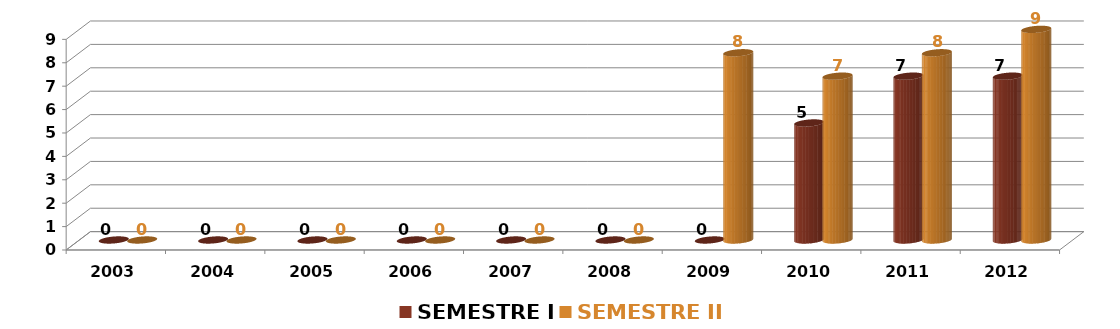
| Category | SEMESTRE I | SEMESTRE II |
|---|---|---|
| 2003.0 | 0 | 0 |
| 2004.0 | 0 | 0 |
| 2005.0 | 0 | 0 |
| 2006.0 | 0 | 0 |
| 2007.0 | 0 | 0 |
| 2008.0 | 0 | 0 |
| 2009.0 | 0 | 8 |
| 2010.0 | 5 | 7 |
| 2011.0 | 7 | 8 |
| 2012.0 | 7 | 9 |